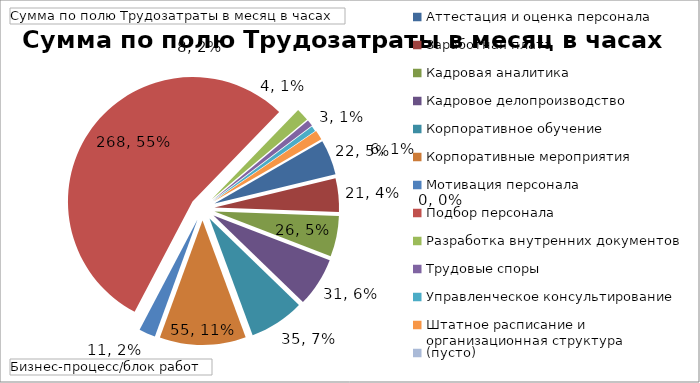
| Category | Итог |
|---|---|
| Аттестация и оценка персонала | 22.333 |
| Заработная плата | 21.375 |
| Кадровая аналитика | 26 |
| Кадровое делопроизводство | 31.367 |
| Корпоративное обучение | 35 |
| Корпоративные мероприятия | 55 |
| Мотивация персонала | 10.5 |
| Подбор персонала | 268 |
| Разработка внутренних документов | 8.167 |
| Трудовые споры | 4 |
| Управленческое консультирование | 3.375 |
| Штатное расписание и организационная структура | 6.167 |
| (пусто) | 0 |